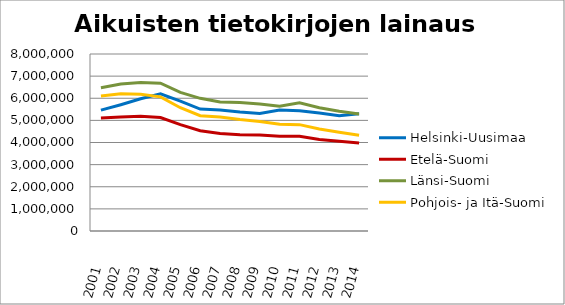
| Category | Helsinki-Uusimaa | Etelä-Suomi | Länsi-Suomi | Pohjois- ja Itä-Suomi |
|---|---|---|---|---|
| 2001.0 | 5461450 | 5112174 | 6475031 | 6105245 |
| 2002.0 | 5707360 | 5152719 | 6640207 | 6203632 |
| 2003.0 | 5974415 | 5180877 | 6709642 | 6183342 |
| 2004.0 | 6204093 | 5127601 | 6677490 | 6063331 |
| 2005.0 | 5870621 | 4805065 | 6264267 | 5572477 |
| 2006.0 | 5510945 | 4530491 | 5995653 | 5211168 |
| 2007.0 | 5465344 | 4407278 | 5833883 | 5149637 |
| 2008.0 | 5379389 | 4351086 | 5802498 | 5036009 |
| 2009.0 | 5314366 | 4342105 | 5740652 | 4954155 |
| 2010.0 | 5465651 | 4284363 | 5639735 | 4829887 |
| 2011.0 | 5433067 | 4276962 | 5793552 | 4807631 |
| 2012.0 | 5331212 | 4132862 | 5573728 | 4608519 |
| 2013.0 | 5210329 | 4061738 | 5411346 | 4459448 |
| 2014.0 | 5300241 | 3979851 | 5289592 | 4323592 |